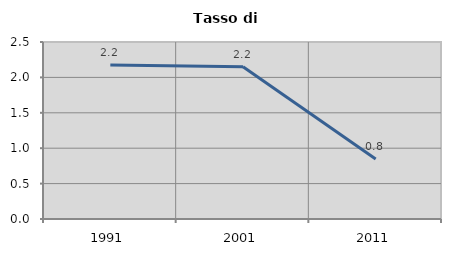
| Category | Tasso di disoccupazione   |
|---|---|
| 1991.0 | 2.174 |
| 2001.0 | 2.151 |
| 2011.0 | 0.847 |